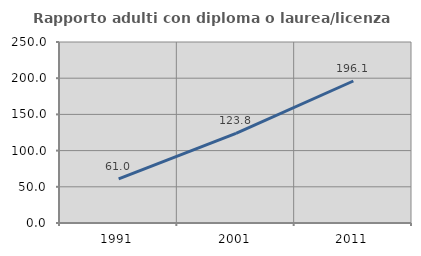
| Category | Rapporto adulti con diploma o laurea/licenza media  |
|---|---|
| 1991.0 | 60.985 |
| 2001.0 | 123.767 |
| 2011.0 | 196.14 |